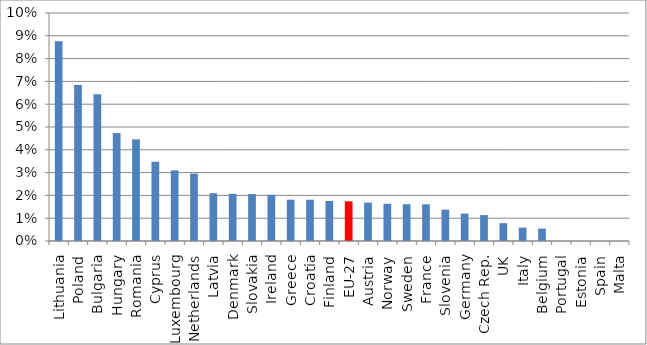
| Category | Series 0 |
|---|---|
| Lithuania | 0.088 |
| Poland | 0.068 |
| Bulgaria | 0.064 |
| Hungary | 0.047 |
| Romania | 0.045 |
| Cyprus | 0.035 |
| Luxembourg | 0.031 |
| Netherlands | 0.03 |
| Latvia | 0.021 |
| Denmark | 0.021 |
| Slovakia | 0.021 |
| Ireland | 0.02 |
| Greece | 0.018 |
| Croatia | 0.018 |
| Finland | 0.018 |
| EU-27 | 0.017 |
| Austria | 0.017 |
| Norway | 0.016 |
| Sweden | 0.016 |
| France | 0.016 |
| Slovenia | 0.014 |
| Germany | 0.012 |
| Czech Rep. | 0.011 |
| UK | 0.008 |
| Italy | 0.006 |
| Belgium | 0.005 |
| Portugal | 0 |
| Estonia | 0 |
| Spain | 0 |
| Malta | 0 |